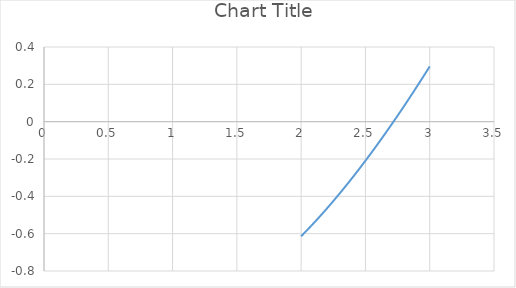
| Category | Series 0 |
|---|---|
| 2.0 | -0.614 |
| 2.02 | -0.6 |
| 2.04 | -0.586 |
| 2.06 | -0.571 |
| 2.08 | -0.557 |
| 2.1 | -0.542 |
| 2.12 | -0.527 |
| 2.14 | -0.512 |
| 2.16 | -0.497 |
| 2.18 | -0.481 |
| 2.2 | -0.465 |
| 2.22 | -0.45 |
| 2.24 | -0.433 |
| 2.26 | -0.417 |
| 2.28 | -0.401 |
| 2.3 | -0.384 |
| 2.32 | -0.368 |
| 2.34 | -0.351 |
| 2.36 | -0.334 |
| 2.38 | -0.316 |
| 2.4 | -0.299 |
| 2.42 | -0.281 |
| 2.44 | -0.264 |
| 2.46 | -0.246 |
| 2.48 | -0.228 |
| 2.5 | -0.209 |
| 2.52 | -0.191 |
| 2.54 | -0.172 |
| 2.56 | -0.154 |
| 2.58 | -0.135 |
| 2.6 | -0.116 |
| 2.62 | -0.096 |
| 2.64 | -0.077 |
| 2.66 | -0.058 |
| 2.68 | -0.038 |
| 2.7 | -0.018 |
| 2.72 | 0.002 |
| 2.74 | 0.022 |
| 2.76 | 0.042 |
| 2.78 | 0.062 |
| 2.8 | 0.083 |
| 2.82 | 0.104 |
| 2.84 | 0.124 |
| 2.86 | 0.145 |
| 2.88 | 0.166 |
| 2.9 | 0.188 |
| 2.92 | 0.209 |
| 2.94 | 0.231 |
| 2.96 | 0.252 |
| 2.98 | 0.274 |
| 3.0 | 0.296 |